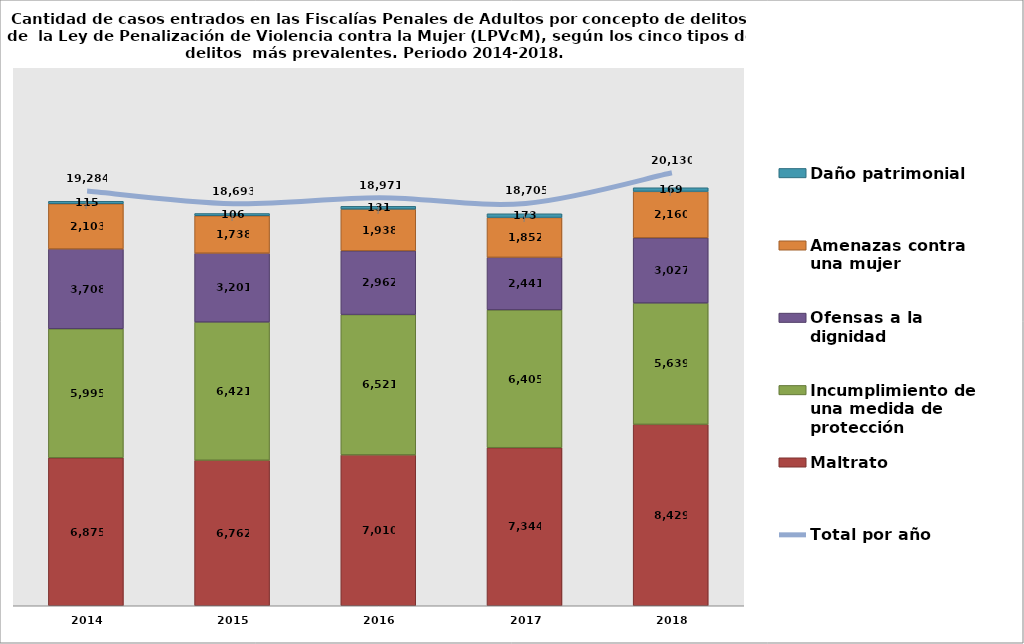
| Category | Maltrato | Incumplimiento de una medida de protección | Ofensas a la dignidad | Amenazas contra una mujer | Daño patrimonial |
|---|---|---|---|---|---|
| 2014.0 | 6875 | 5995 | 3708 | 2103 | 115 |
| 2015.0 | 6762 | 6421 | 3201 | 1738 | 106 |
| 2016.0 | 7010 | 6521 | 2962 | 1938 | 131 |
| 2017.0 | 7344 | 6405 | 2441 | 1852 | 173 |
| 2018.0 | 8429 | 5639 | 3027 | 2160 | 169 |